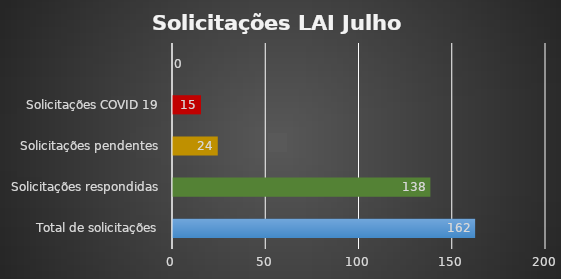
| Category | Series 0 |
|---|---|
| Total de solicitações | 162 |
| Solicitações respondidas | 138 |
| Solicitações pendentes | 24 |
| Solicitações COVID 19 | 15 |